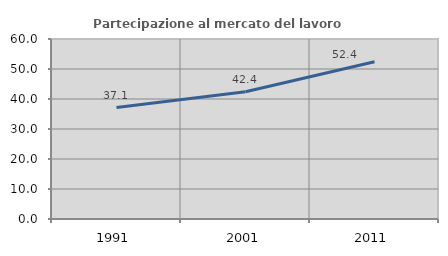
| Category | Partecipazione al mercato del lavoro  femminile |
|---|---|
| 1991.0 | 37.131 |
| 2001.0 | 42.44 |
| 2011.0 | 52.424 |